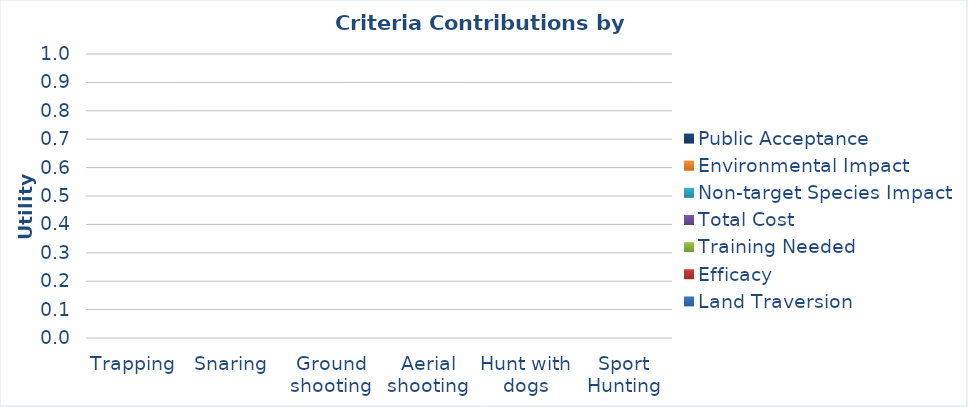
| Category | Land Traversion | Efficacy | Training Needed | Total Cost | Non-target Species Impact | Environmental Impact | Public Acceptance |
|---|---|---|---|---|---|---|---|
| Trapping | 0 | 0 | 0 | 0 | 0 | 0 | 0 |
| Snaring | 0 | 0 | 0 | 0 | 0 | 0 | 0 |
| Ground shooting | 0 | 0 | 0 | 0 | 0 | 0 | 0 |
| Aerial shooting | 0 | 0 | 0 | 0 | 0 | 0 | 0 |
| Hunt with dogs | 0 | 0 | 0 | 0 | 0 | 0 | 0 |
| Sport Hunting | 0 | 0 | 0 | 0 | 0 | 0 | 0 |